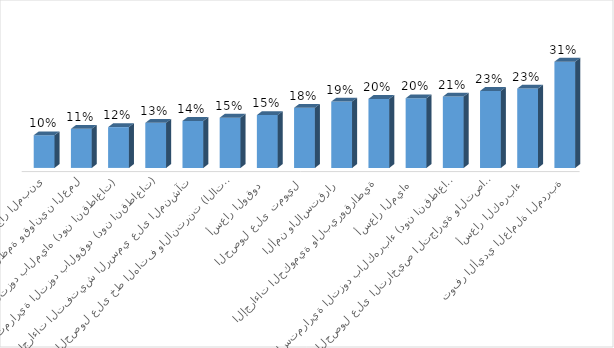
| Category | نعم |
|---|---|
| توفر الأيدي العاملة المدربة | 0.311 |
| أسعار الكهرباء | 0.233 |
| الحصول على التراخيص التجارية والتصاريح | 0.225 |
| استمرارية التزود بالكهرباء (دون انقطاعات) | 0.209 |
| أسعار المياه | 0.204 |
| الإجراءات الحكومية والبيروقراطية | 0.202 |
| الأمن والاستقرار | 0.194 |
| الحصول على تمويل | 0.176 |
| أسعار الوقود | 0.155 |
| الحصول على خط الهاتف والانترنت (الاتصالات) | 0.147 |
| إجراءات التفتيش الرسمي على المنشآت | 0.138 |
| استمرارية التزود بالوقود (دون انقطاعات) | 0.132 |
| استمرارية التزود بالمياه (دون انقطاعات) | 0.119 |
| أنظمة وقوانين العمل | 0.115 |
| الحصول على الموقع / استئجار المبنى | 0.096 |